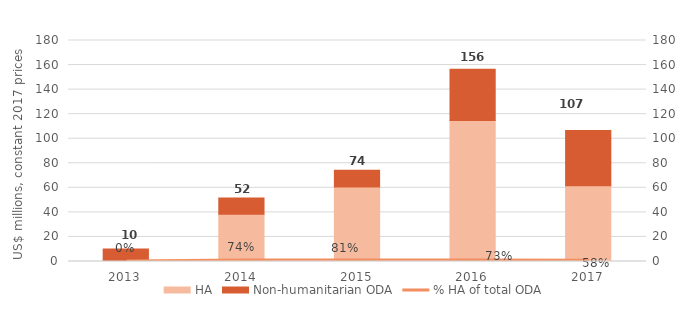
| Category | HA | Non-humanitarian ODA |
|---|---|---|
| 2013.0 | 0 | 10.183 |
| 2014.0 | 38.446 | 13.353 |
| 2015.0 | 60.649 | 13.772 |
| 2016.0 | 114.875 | 41.61 |
| 2017.0 | 61.754 | 44.915 |